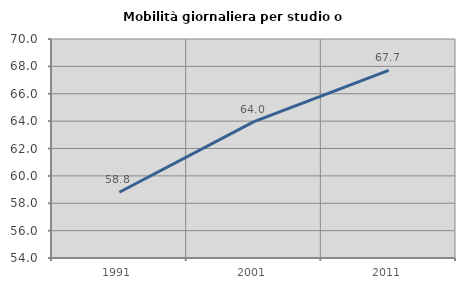
| Category | Mobilità giornaliera per studio o lavoro |
|---|---|
| 1991.0 | 58.8 |
| 2001.0 | 63.967 |
| 2011.0 | 67.715 |